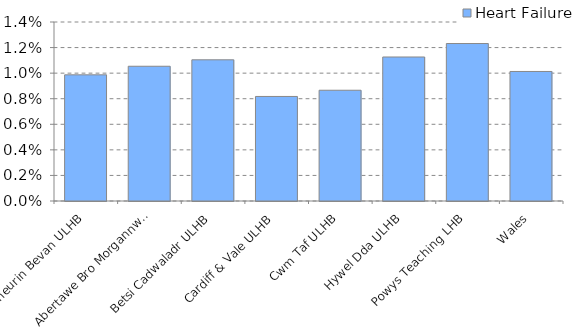
| Category | Heart Failure  |
|---|---|
| Aneurin Bevan ULHB | 0.01 |
| Abertawe Bro Morgannwg ULHB | 0.011 |
| Betsi Cadwaladr ULHB | 0.011 |
| Cardiff & Vale ULHB | 0.008 |
| Cwm Taf ULHB | 0.009 |
| Hywel Dda ULHB | 0.011 |
| Powys Teaching LHB | 0.012 |
| Wales | 0.01 |